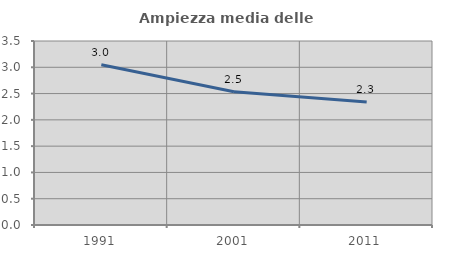
| Category | Ampiezza media delle famiglie |
|---|---|
| 1991.0 | 3.049 |
| 2001.0 | 2.536 |
| 2011.0 | 2.339 |